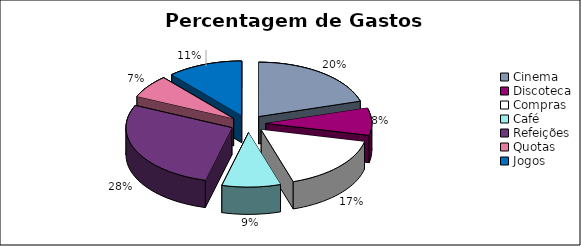
| Category | Total Ano |
|---|---|
| Cinema | 480 |
| Discoteca | 190 |
| Compras | 390 |
| Café | 210 |
| Refeições | 650 |
| Quotas | 160 |
| Jogos | 270 |